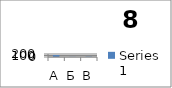
| Category | Series 0 |
|---|---|
| А | 127 |
| Б | 10 |
| В | 27 |